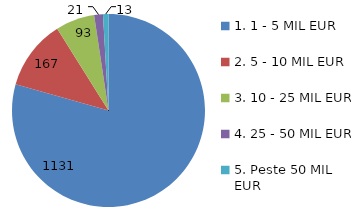
| Category | Series 0 |
|---|---|
| 1. 1 - 5 MIL EUR | 1131 |
| 2. 5 - 10 MIL EUR | 167 |
| 3. 10 - 25 MIL EUR | 93 |
| 4. 25 - 50 MIL EUR | 21 |
| 5. Peste 50 MIL EUR | 13 |